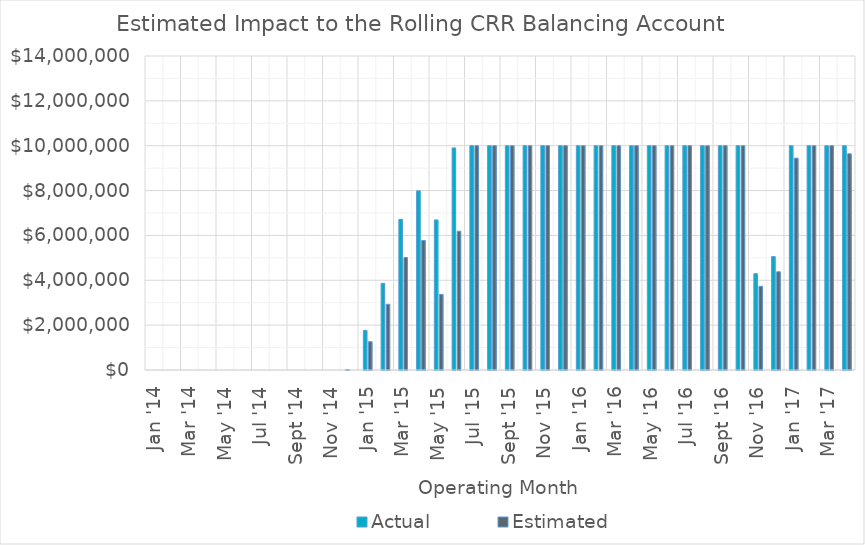
| Category | Actual | Estimated |
|---|---|---|
| 2014-01-01 | 0 | 0 |
| 2014-02-01 | 0 | 0 |
| 2014-03-01 | 0 | 0 |
| 2014-04-01 | 0 | 0 |
| 2014-05-01 | 0 | 0 |
| 2014-06-01 | 0 | 0 |
| 2014-07-01 | 0 | 0 |
| 2014-08-01 | 0 | 0 |
| 2014-09-01 | 0 | 0 |
| 2014-10-01 | 0 | 0 |
| 2014-11-01 | 0 | 0 |
| 2014-12-01 | 20580 | 0 |
| 2015-01-01 | 1767929 | 1262408.288 |
| 2015-02-01 | 3864535 | 2929297.482 |
| 2015-03-01 | 6717548 | 5015303.656 |
| 2015-04-01 | 7988176.04 | 5773233.218 |
| 2015-05-01 | 6692320.78 | 3371361.441 |
| 2015-06-01 | 9903649.57 | 6188236.382 |
| 2015-07-01 | 10000000 | 10000000 |
| 2015-08-01 | 10000000 | 10000000 |
| 2015-09-01 | 10000000 | 10000000 |
| 2015-10-01 | 10000000 | 10000000 |
| 2015-11-01 | 10000000 | 10000000 |
| 2015-12-01 | 10000000 | 10000000 |
| 2016-01-01 | 10000000 | 10000000 |
| 2016-02-01 | 10000000 | 10000000 |
| 2016-03-01 | 10000000 | 10000000 |
| 2016-04-01 | 10000000 | 10000000 |
| 2016-05-01 | 10000000 | 10000000 |
| 2016-06-01 | 10000000 | 10000000 |
| 2016-07-01 | 10000000 | 10000000 |
| 2016-08-01 | 10000000 | 10000000 |
| 2016-09-01 | 10000000 | 10000000 |
| 2016-10-01 | 10000000 | 10000000 |
| 2016-11-01 | 4294673.94 | 3733020.945 |
| 2016-12-01 | 5056687.29 | 4379469.992 |
| 2017-01-01 | 10000000 | 9445760.415 |
| 2017-02-01 | 10000000 | 10000000 |
| 2017-03-01 | 10000000 | 10000000 |
| 2017-04-01 | 10000000 | 9638542.433 |